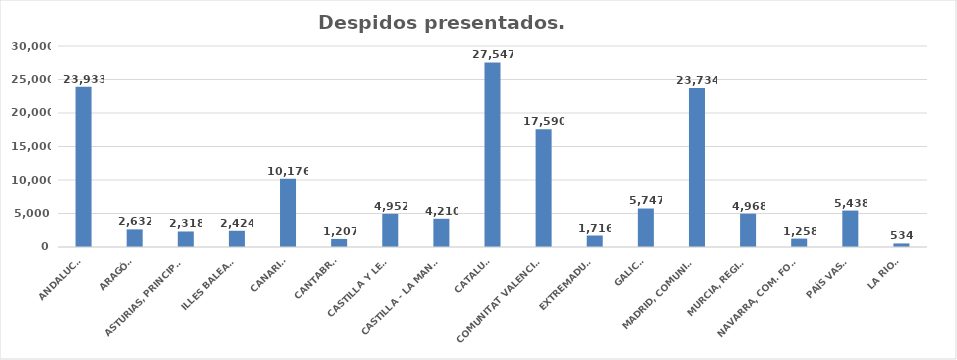
| Category | Series 0 |
|---|---|
| ANDALUCÍA | 23933 |
| ARAGÓN | 2632 |
| ASTURIAS, PRINCIPADO | 2318 |
| ILLES BALEARS | 2424 |
| CANARIAS | 10176 |
| CANTABRIA | 1207 |
| CASTILLA Y LEÓN | 4952 |
| CASTILLA - LA MANCHA | 4210 |
| CATALUÑA | 27547 |
| COMUNITAT VALENCIANA | 17590 |
| EXTREMADURA | 1716 |
| GALICIA | 5747 |
| MADRID, COMUNIDAD | 23734 |
| MURCIA, REGIÓN | 4968 |
| NAVARRA, COM. FORAL | 1258 |
| PAÍS VASCO | 5438 |
| LA RIOJA | 534 |